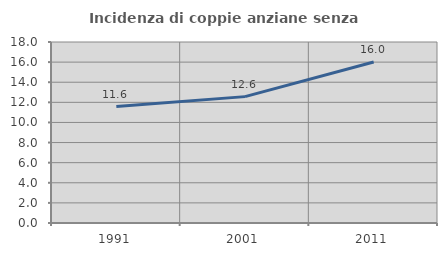
| Category | Incidenza di coppie anziane senza figli  |
|---|---|
| 1991.0 | 11.574 |
| 2001.0 | 12.567 |
| 2011.0 | 16.01 |